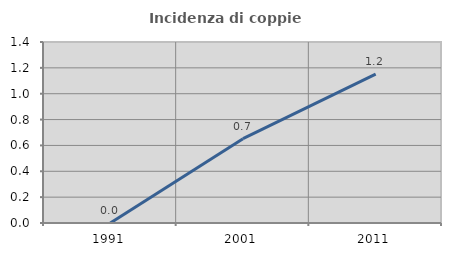
| Category | Incidenza di coppie miste |
|---|---|
| 1991.0 | 0 |
| 2001.0 | 0.652 |
| 2011.0 | 1.151 |